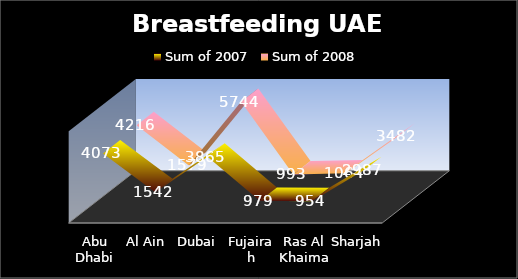
| Category | Sum of 2007 | Sum of 2008 |
|---|---|---|
| Abu Dhabi | 4073 | 4216 |
| Al Ain | 1542 | 1579 |
| Dubai | 3865 | 5744 |
| Fujairah | 979 | 993 |
| Ras Al Khaimah | 954 | 1064 |
| Sharjah | 2987 | 3482 |